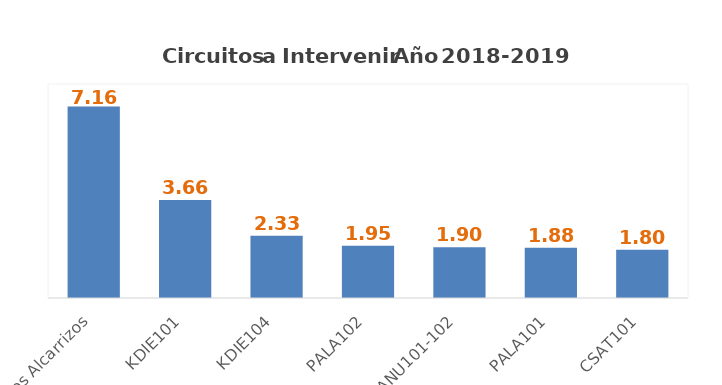
| Category | Series 0 |
|---|---|
| Los Alcarrizos | 7.16 |
| KDIE101 | 3.66 |
| KDIE104 | 2.33 |
| PALA102 | 1.95 |
| HANU101-102 | 1.9 |
| PALA101 | 1.88 |
| CSAT101 | 1.8 |